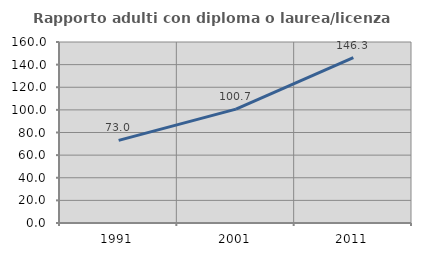
| Category | Rapporto adulti con diploma o laurea/licenza media  |
|---|---|
| 1991.0 | 73.012 |
| 2001.0 | 100.702 |
| 2011.0 | 146.272 |